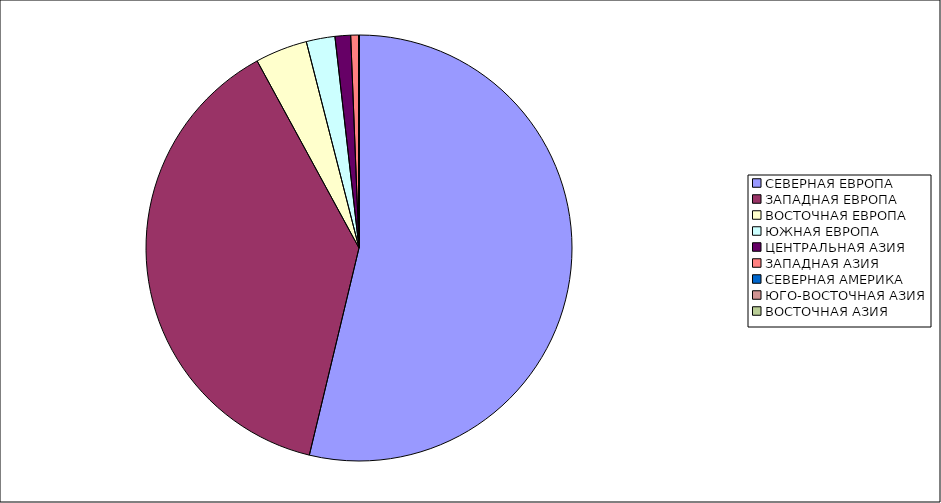
| Category | Оборот |
|---|---|
| СЕВЕРНАЯ ЕВРОПА | 53.746 |
| ЗАПАДНАЯ ЕВРОПА | 38.318 |
| ВОСТОЧНАЯ ЕВРОПА | 3.956 |
| ЮЖНАЯ ЕВРОПА | 2.175 |
| ЦЕНТРАЛЬНАЯ АЗИЯ | 1.183 |
| ЗАПАДНАЯ АЗИЯ | 0.597 |
| СЕВЕРНАЯ АМЕРИКА | 0.025 |
| ЮГО-ВОСТОЧНАЯ АЗИЯ | 0.001 |
| ВОСТОЧНАЯ АЗИЯ | 0.001 |